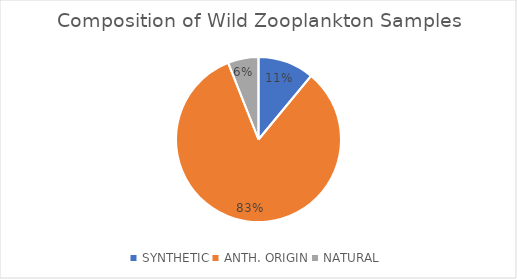
| Category | Series 0 |
|---|---|
| SYNTHETIC | 0.11 |
| ANTH. ORIGIN | 0.83 |
| NATURAL | 0.06 |